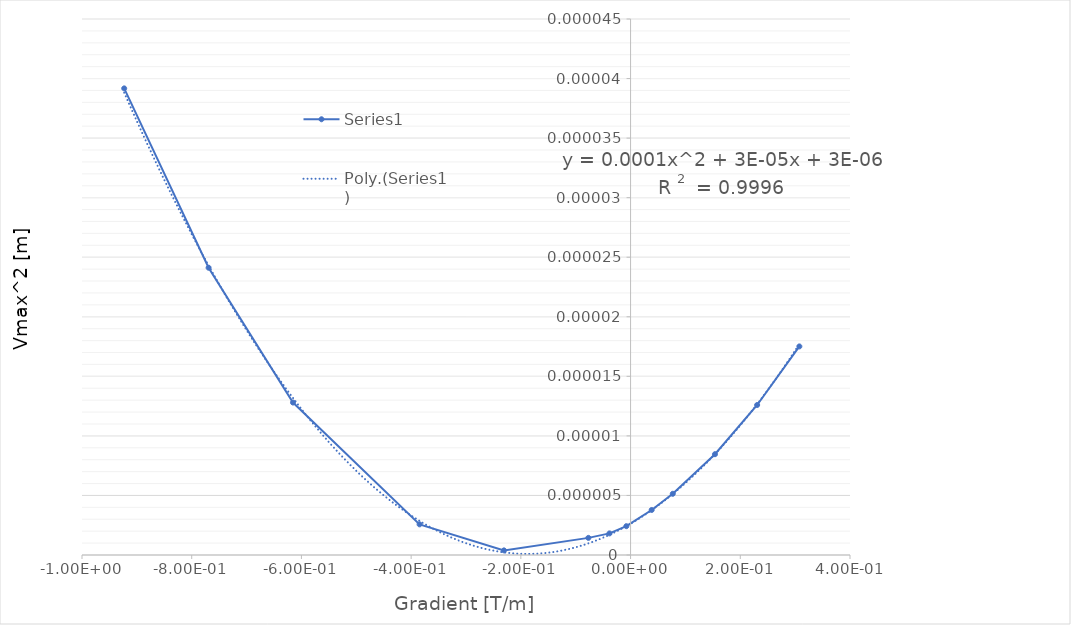
| Category | Series 0 |
|---|---|
| -0.923076923076923 | 0 |
| -0.769230769230769 | 0 |
| -0.615384615384615 | 0 |
| -0.384615384615385 | 0 |
| -0.230769230769231 | 0 |
| -0.0769230769230769 | 0 |
| -0.0384615384615385 | 0 |
| -0.00769230769230769 | 0 |
| 0.0384615384615385 | 0 |
| 0.0769230769230769 | 0 |
| 0.153846153846154 | 0 |
| 0.230769230769231 | 0 |
| 0.307692307692308 | 0 |